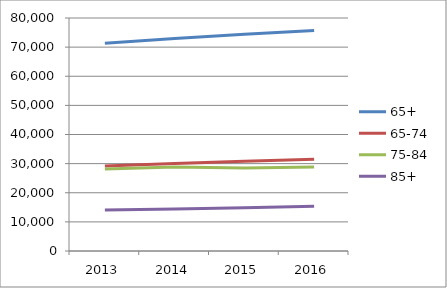
| Category | 65+ | 65-74 | 75-84 | 85+ |
|---|---|---|---|---|
| 2013.0 | 71364 | 29150 | 28161 | 14053 |
| 2014.0 | 72987 | 30043 | 28818 | 14455 |
| 2015.0 | 74451 | 30777 | 28489 | 14856 |
| 2016.0 | 75718 | 31542 | 28818 | 15358 |